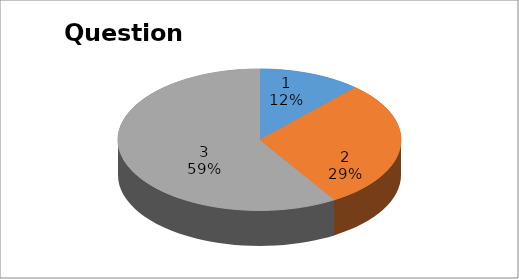
| Category | Series 0 |
|---|---|
| 0 | 2 |
| 1 | 5 |
| 2 | 10 |